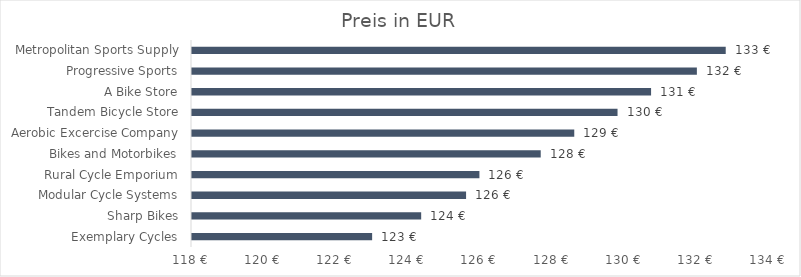
| Category | Preis in EUR |
|---|---|
| Exemplary Cycles | 122.995 |
| Sharp Bikes | 124.355 |
| Modular Cycle Systems | 125.6 |
| Rural Cycle Emporium | 125.97 |
| Bikes and Motorbikes | 127.67 |
| Aerobic Excercise Company | 128.6 |
| Tandem Bicycle Store | 129.8 |
| A Bike Store | 130.73 |
| Progressive Sports | 132 |
| Metropolitan Sports Supply | 132.8 |